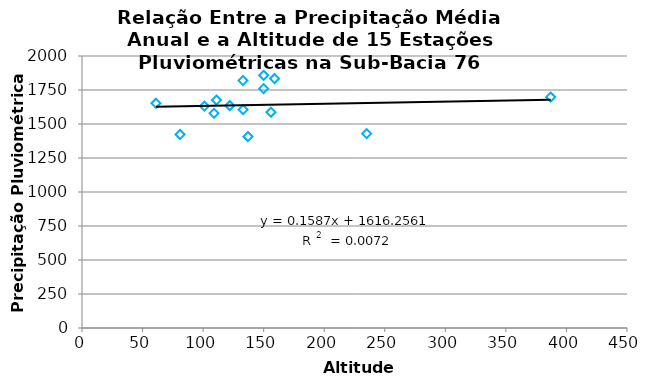
| Category | Series 0 |
|---|---|
| 150.0 | 1759.8 |
| 235.0 | 1429.164 |
| 387.0 | 1697.783 |
| 133.0 | 1605.94 |
| 133.0 | 1819.897 |
| 159.0 | 1834.257 |
| 150.0 | 1858.42 |
| 137.0 | 1407.673 |
| 111.0 | 1675.89 |
| 101.0 | 1631.573 |
| 109.0 | 1578.843 |
| 61.0 | 1652.841 |
| 156.0 | 1586.737 |
| 122.0 | 1635.112 |
| 81.0 | 1423.088 |